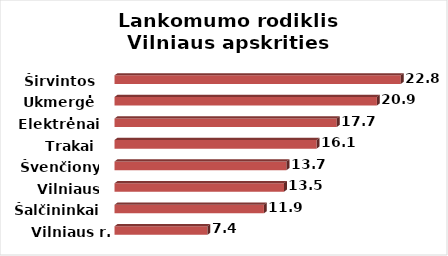
| Category | Series 0 |
|---|---|
| Vilniaus r. | 7.4 |
| Šalčininkai | 11.9 |
| Vilniaus m. | 13.5 |
| Švenčionys | 13.7 |
| Trakai | 16.1 |
| Elektrėnai | 17.7 |
| Ukmergė | 20.9 |
| Širvintos | 22.8 |